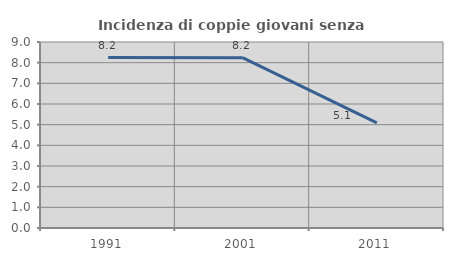
| Category | Incidenza di coppie giovani senza figli |
|---|---|
| 1991.0 | 8.245 |
| 2001.0 | 8.24 |
| 2011.0 | 5.085 |